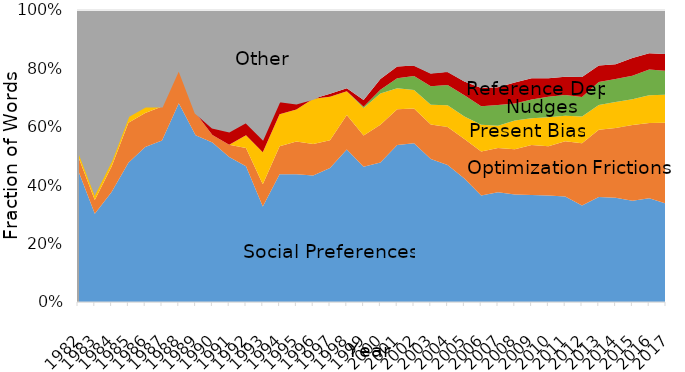
| Category | Social Preferences | Optimization Frictions | Present Bias | Nudges | Reference Dependence | Biased Beliefs | Other |
|---|---|---|---|---|---|---|---|
| 1982.0 | 0.452 | 0.047 | 0.022 | 0 | 0 | 0 | 0.478 |
| 1983.0 | 0.302 | 0.047 | 0.022 | 0 | 0 | 0 | 0.628 |
| 1984.0 | 0.377 | 0.087 | 0.022 | 0 | 0 | 0 | 0.514 |
| 1985.0 | 0.477 | 0.137 | 0.022 | 0 | 0 | 0 | 0.364 |
| 1986.0 | 0.531 | 0.116 | 0.022 | 0 | 0 | 0 | 0.331 |
| 1987.0 | 0.553 | 0.116 | 0 | 0 | 0 | 0 | 0.331 |
| 1988.0 | 0.681 | 0.116 | 0 | 0 | 0 | 0 | 0.203 |
| 1989.0 | 0.571 | 0.076 | 0 | 0 | 0 | 0 | 0.353 |
| 1990.0 | 0.546 | 0.026 | 0 | 0 | 0.025 | 0 | 0.403 |
| 1991.0 | 0.497 | 0.042 | 0 | 0 | 0.045 | 0 | 0.416 |
| 1992.0 | 0.465 | 0.063 | 0.043 | 0 | 0.045 | 0 | 0.384 |
| 1993.0 | 0.327 | 0.076 | 0.11 | 0 | 0.045 | 0 | 0.442 |
| 1994.0 | 0.437 | 0.096 | 0.11 | 0 | 0.045 | 0 | 0.312 |
| 1995.0 | 0.437 | 0.113 | 0.11 | 0 | 0.02 | 0 | 0.32 |
| 1996.0 | 0.433 | 0.108 | 0.155 | 0 | 0 | 0 | 0.304 |
| 1997.0 | 0.459 | 0.095 | 0.149 | 0 | 0.01 | 0.01 | 0.277 |
| 1998.0 | 0.522 | 0.118 | 0.082 | 0 | 0.01 | 0.01 | 0.258 |
| 1999.0 | 0.463 | 0.108 | 0.094 | 0.004 | 0.024 | 0.01 | 0.298 |
| 2000.0 | 0.478 | 0.129 | 0.107 | 0.012 | 0.037 | 0.01 | 0.227 |
| 2001.0 | 0.538 | 0.122 | 0.072 | 0.034 | 0.04 | 0.01 | 0.184 |
| 2002.0 | 0.544 | 0.118 | 0.064 | 0.048 | 0.036 | 0.002 | 0.188 |
| 2003.0 | 0.49 | 0.118 | 0.067 | 0.063 | 0.044 | 0.002 | 0.215 |
| 2004.0 | 0.469 | 0.13 | 0.074 | 0.069 | 0.045 | 0.002 | 0.209 |
| 2005.0 | 0.423 | 0.135 | 0.077 | 0.072 | 0.047 | 0.004 | 0.241 |
| 2006.0 | 0.364 | 0.151 | 0.092 | 0.063 | 0.063 | 0.007 | 0.26 |
| 2007.0 | 0.376 | 0.152 | 0.077 | 0.071 | 0.06 | 0.006 | 0.259 |
| 2008.0 | 0.368 | 0.155 | 0.098 | 0.059 | 0.072 | 0.01 | 0.238 |
| 2009.0 | 0.366 | 0.171 | 0.092 | 0.064 | 0.073 | 0.01 | 0.224 |
| 2010.0 | 0.364 | 0.169 | 0.099 | 0.07 | 0.064 | 0.015 | 0.218 |
| 2011.0 | 0.361 | 0.189 | 0.087 | 0.071 | 0.062 | 0.015 | 0.214 |
| 2012.0 | 0.331 | 0.213 | 0.091 | 0.067 | 0.069 | 0.018 | 0.212 |
| 2013.0 | 0.36 | 0.23 | 0.085 | 0.079 | 0.057 | 0.018 | 0.172 |
| 2014.0 | 0.357 | 0.239 | 0.089 | 0.079 | 0.051 | 0.025 | 0.161 |
| 2015.0 | 0.347 | 0.259 | 0.089 | 0.08 | 0.06 | 0.02 | 0.144 |
| 2016.0 | 0.355 | 0.258 | 0.095 | 0.088 | 0.056 | 0.019 | 0.129 |
| 2017.0 | 0.337 | 0.277 | 0.096 | 0.082 | 0.058 | 0.021 | 0.129 |